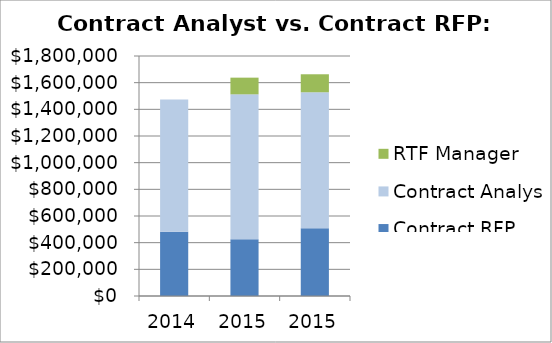
| Category | Contract RFP | Contract Analysts | RTF Manager |
|---|---|---|---|
| 2014.0 | 482000 | 991000 | 0 |
| 2015.0 | 425600 | 1087000 | 125000 |
| 2015.0 | 508000 | 1020000 | 135000 |